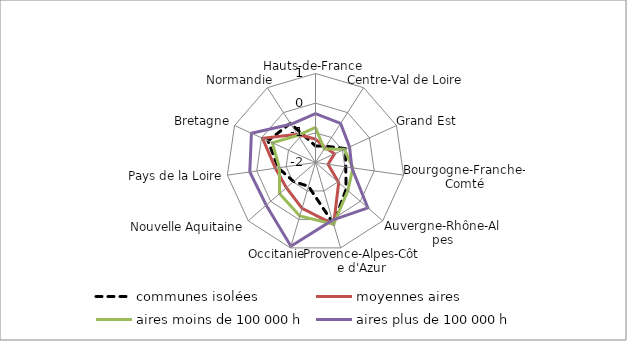
| Category | communes isolées | moyennes aires | aires moins de 100 000 h | aires plus de 100 000 h |
|---|---|---|---|---|
| Hauts-de-France | -1.441 | -1.212 | -0.819 | -0.35 |
| Centre-Val de Loire | -1.348 | -1.397 | -1.457 | -0.437 |
| Grand Est | -0.875 | -1.294 | -0.931 | -0.738 |
| Bourgogne-Franche-Comté | -0.971 | -1.572 | -0.726 | -0.763 |
| Auvergne-Rhône-Alpes | -0.631 | -0.965 | -0.556 | 0.334 |
| Provence-Alpes-Côte d'Azur | 0.147 | 0.172 | 0.168 | 0.024 |
| Occitanie | -1.163 | -0.39 | -0.121 | 0.943 |
| Nouvelle Aquitaine | -1.022 | -0.702 | -0.399 | 0.197 |
| Pays de la Loire | -0.731 | -0.634 | -0.769 | 0.237 |
| Bretagne | -0.239 | -0.04 | -0.401 | 0.374 |
| Normandie | -0.431 | -0.869 | -0.913 | -0.47 |